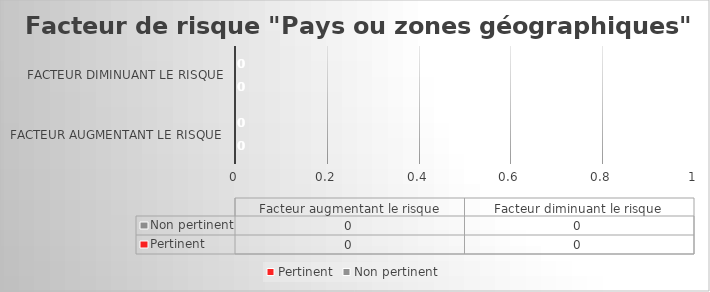
| Category | Pertinent | Non pertinent |
|---|---|---|
| Facteur augmentant le risque | 0 | 0 |
| Facteur diminuant le risque | 0 | 0 |